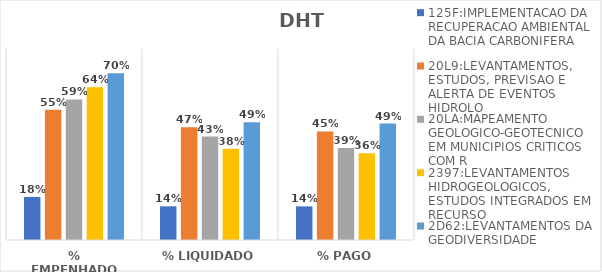
| Category | 125F:IMPLEMENTACAO DA RECUPERACAO AMBIENTAL DA BACIA CARBONIFERA | 20L9:LEVANTAMENTOS, ESTUDOS, PREVISAO E ALERTA DE EVENTOS HIDROLO | 20LA:MAPEAMENTO GEOLOGICO-GEOTECNICO EM MUNICIPIOS CRITICOS COM R | 2397:LEVANTAMENTOS HIDROGEOLOGICOS, ESTUDOS INTEGRADOS EM RECURSO | 2D62:LEVANTAMENTOS DA GEODIVERSIDADE |
|---|---|---|---|---|---|
| % EMPENHADO | 0.18 | 0.545 | 0.589 | 0.64 | 0.698 |
| % LIQUIDADO | 0.141 | 0.472 | 0.433 | 0.382 | 0.493 |
| % PAGO | 0.141 | 0.455 | 0.385 | 0.364 | 0.488 |